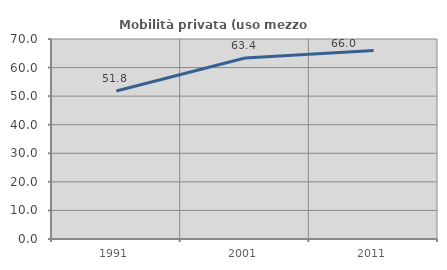
| Category | Mobilità privata (uso mezzo privato) |
|---|---|
| 1991.0 | 51.818 |
| 2001.0 | 63.357 |
| 2011.0 | 65.956 |